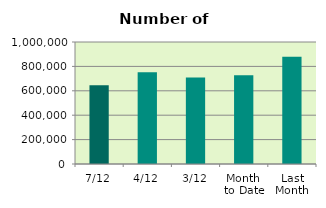
| Category | Series 0 |
|---|---|
| 7/12 | 645132 |
| 4/12 | 751702 |
| 3/12 | 709054 |
| Month 
to Date | 727893.6 |
| Last
Month | 879957.333 |